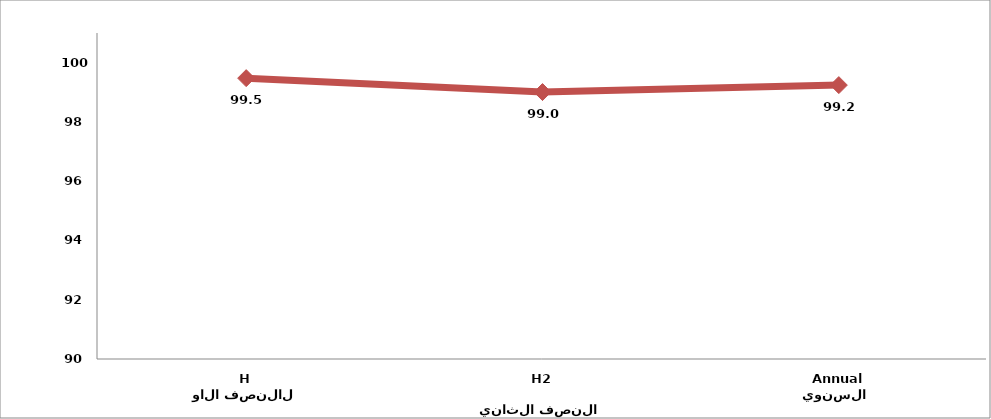
| Category | الرقم  القياسي العام 
General Index


 |
|---|---|
| النصف الاول
H1 | 99.476 |
| النصف الثاني 
H2 | 99.007 |
| السنوي 
Annual | 99.242 |